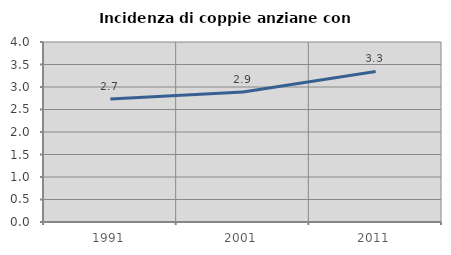
| Category | Incidenza di coppie anziane con figli |
|---|---|
| 1991.0 | 2.731 |
| 2001.0 | 2.89 |
| 2011.0 | 3.346 |